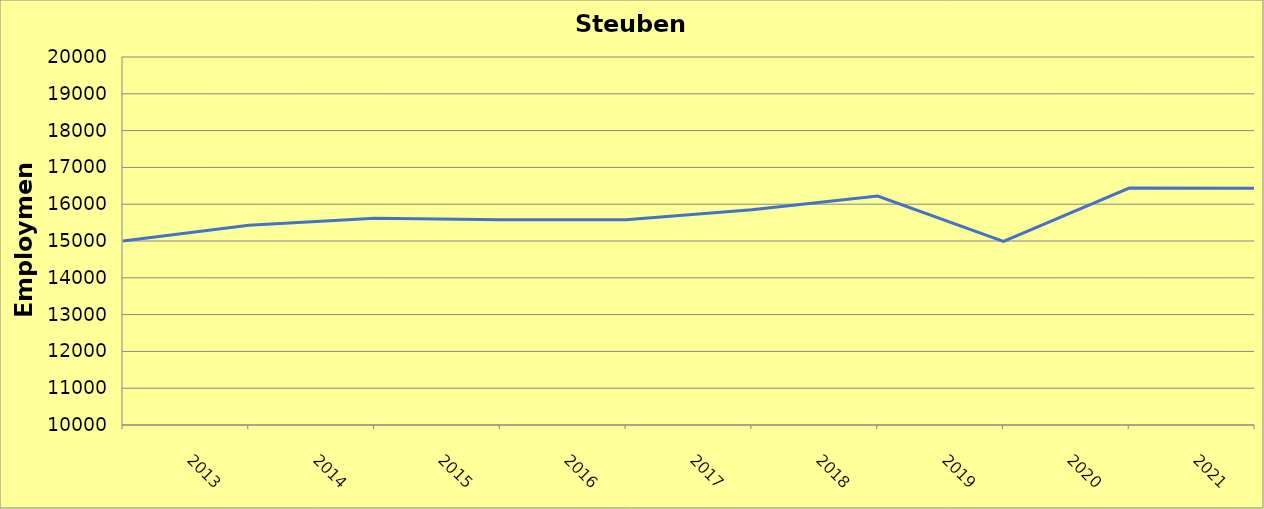
| Category | Steuben County |
|---|---|
| 2013.0 | 15000 |
| 2014.0 | 15430 |
| 2015.0 | 15620 |
| 2016.0 | 15580 |
| 2017.0 | 15580 |
| 2018.0 | 15850 |
| 2019.0 | 16220 |
| 2020.0 | 14990 |
| 2021.0 | 16440 |
| 2022.0 | 16435 |